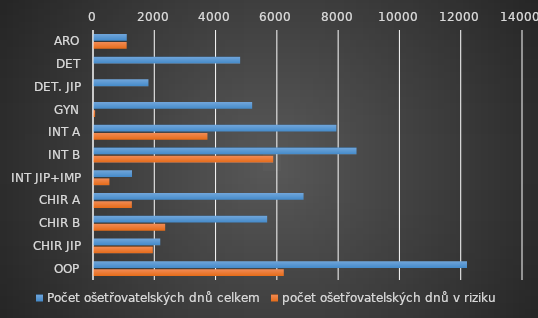
| Category | Počet ošetřovatelských dnů celkem | počet ošetřovatelských dnů v riziku |
|---|---|---|
| ARO | 1070 | 1066 |
| DET | 4769 | 0 |
| DET. JIP | 1777 | 0 |
| GYN | 5161 | 36 |
| INT A | 7909 | 3702 |
| INT B | 8567 | 5848 |
| INT JIP+IMP | 1240 | 503 |
| CHIR A | 6839 | 1236 |
| CHIR B | 5651 | 2322 |
| CHIR JIP | 2162 | 1919 |
| OOP | 12172 | 6194 |